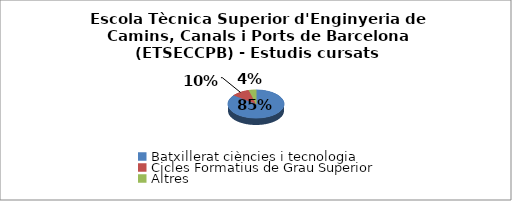
| Category | Escola Tècnica Superior d'Enginyeria de Camins, Canals i Ports de Barcelona (ETSECCPB) - Estudis cursats |
|---|---|
| Batxillerat ciències i tecnologia | 0.854 |
| Cicles Formatius de Grau Superior | 0.104 |
| Altres | 0.042 |